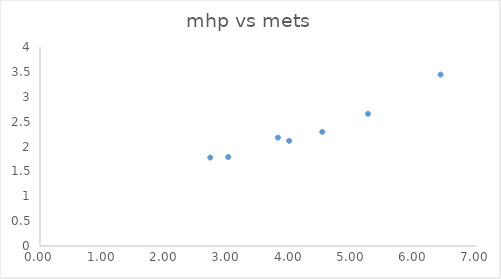
| Category | mhp vs mets  |
|---|---|
| 2.7338129496402876 | 1.778 |
| 3.0215827338129495 | 1.789 |
| 3.820143884892086 | 2.178 |
| 4.0 | 2.115 |
| 4.532374100719425 | 2.294 |
| 5.266187050359712 | 2.655 |
| 6.431654676258993 | 3.445 |